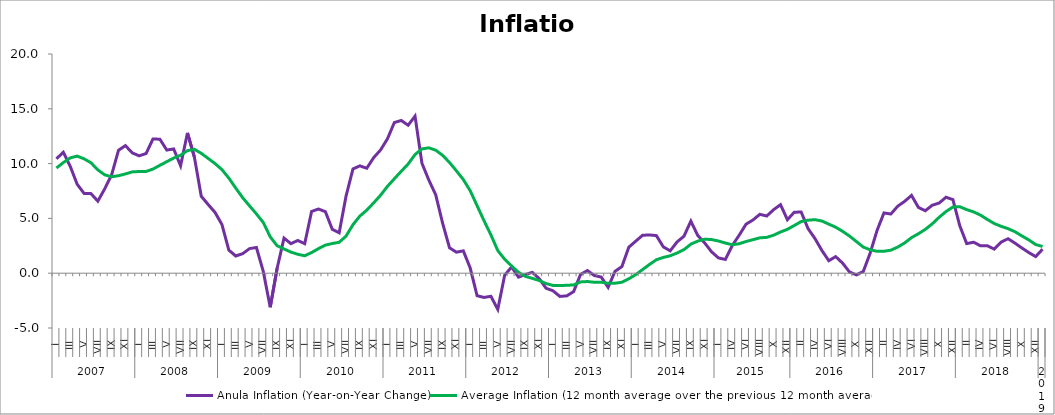
| Category | Anula Inflation (Year-on-Year Change) | Average Inflation (12 month average over the previous 12 month average) |
|---|---|---|
| 0 | 10.438 | 9.597 |
| 1 | 11.037 | 10.095 |
| 2 | 9.747 | 10.522 |
| 3 | 8.122 | 10.685 |
| 4 | 7.281 | 10.437 |
| 5 | 7.263 | 10.079 |
| 6 | 6.574 | 9.429 |
| 7 | 7.699 | 8.974 |
| 8 | 8.969 | 8.798 |
| 9 | 11.218 | 8.895 |
| 10 | 11.64 | 9.057 |
| 11 | 10.975 | 9.245 |
| 12 | 10.707 | 9.279 |
| 13 | 10.919 | 9.283 |
| 14 | 12.25 | 9.503 |
| 15 | 12.224 | 9.846 |
| 16 | 11.235 | 10.174 |
| 17 | 11.337 | 10.508 |
| 18 | 9.804 | 10.764 |
| 19 | 12.799 | 11.182 |
| 20 | 10.605 | 11.308 |
| 21 | 7.02 | 10.938 |
| 22 | 6.267 | 10.471 |
| 23 | 5.548 | 9.999 |
| 24 | 4.441 | 9.447 |
| 25 | 2.094 | 8.674 |
| 26 | 1.572 | 7.765 |
| 27 | 1.785 | 6.892 |
| 28 | 2.242 | 6.143 |
| 29 | 2.347 | 5.409 |
| 30 | 0.141 | 4.621 |
| 31 | -3.106 | 3.318 |
| 32 | 0.44 | 2.508 |
| 33 | 3.203 | 2.209 |
| 34 | 2.697 | 1.927 |
| 35 | 2.986 | 1.728 |
| 36 | 2.693 | 1.589 |
| 37 | 5.633 | 1.886 |
| 38 | 5.858 | 2.242 |
| 39 | 5.612 | 2.561 |
| 40 | 4.006 | 2.709 |
| 41 | 3.689 | 2.822 |
| 42 | 7.048 | 3.383 |
| 43 | 9.512 | 4.43 |
| 44 | 9.794 | 5.213 |
| 45 | 9.576 | 5.753 |
| 46 | 10.542 | 6.417 |
| 47 | 11.241 | 7.111 |
| 48 | 12.26 | 7.923 |
| 49 | 13.747 | 8.617 |
| 50 | 13.936 | 9.3 |
| 51 | 13.499 | 9.961 |
| 52 | 14.332 | 10.824 |
| 53 | 10.034 | 11.341 |
| 54 | 8.499 | 11.44 |
| 55 | 7.154 | 11.224 |
| 56 | 4.562 | 10.754 |
| 57 | 2.318 | 10.102 |
| 58 | 1.917 | 9.34 |
| 59 | 2.041 | 8.543 |
| 60 | 0.478 | 7.527 |
| 61 | -2.055 | 6.159 |
| 62 | -2.211 | 4.793 |
| 63 | -2.105 | 3.5 |
| 64 | -3.3 | 2.066 |
| 65 | -0.18 | 1.269 |
| 66 | 0.565 | 0.665 |
| 67 | -0.359 | 0.081 |
| 68 | -0.121 | -0.289 |
| 69 | 0.078 | -0.469 |
| 70 | -0.487 | -0.664 |
| 71 | -1.373 | -0.944 |
| 72 | -1.6 | -1.117 |
| 73 | -2.117 | -1.12 |
| 74 | -2.069 | -1.106 |
| 75 | -1.678 | -1.069 |
| 76 | -0.112 | -0.796 |
| 77 | 0.241 | -0.761 |
| 78 | -0.212 | -0.824 |
| 79 | -0.353 | -0.824 |
| 80 | -1.294 | -0.921 |
| 81 | 0.173 | -0.913 |
| 82 | 0.607 | -0.823 |
| 83 | 2.372 | -0.512 |
| 84 | 2.92 | -0.135 |
| 85 | 3.461 | 0.332 |
| 86 | 3.492 | 0.798 |
| 87 | 3.429 | 1.227 |
| 88 | 2.405 | 1.439 |
| 89 | 2.042 | 1.589 |
| 90 | 2.85 | 1.842 |
| 91 | 3.377 | 2.15 |
| 92 | 4.752 | 2.653 |
| 93 | 3.441 | 2.926 |
| 94 | 2.764 | 3.106 |
| 95 | 1.952 | 3.069 |
| 96 | 1.394 | 2.938 |
| 97 | 1.254 | 2.752 |
| 98 | 2.517 | 2.599 |
| 99 | 3.459 | 2.688 |
| 100 | 4.474 | 2.891 |
| 101 | 4.855 | 3.058 |
| 102 | 5.372 | 3.225 |
| 103 | 5.217 | 3.27 |
| 104 | 5.795 | 3.469 |
| 105 | 6.254 | 3.76 |
| 106 | 4.879 | 4.004 |
| 107 | 5.571 | 4.353 |
| 108 | 5.575 | 4.713 |
| 109 | 4.061 | 4.836 |
| 110 | 3.159 | 4.886 |
| 111 | 2.073 | 4.763 |
| 112 | 1.142 | 4.478 |
| 113 | 1.513 | 4.196 |
| 114 | 0.922 | 3.822 |
| 115 | 0.116 | 3.391 |
| 116 | -0.152 | 2.891 |
| 117 | 0.154 | 2.384 |
| 118 | 1.832 | 2.135 |
| 119 | 3.9 | 2 |
| 120 | 5.5 | 2 |
| 121 | 5.4 | 2.1 |
| 122 | 6.115 | 2.385 |
| 123 | 6.556 | 2.758 |
| 124 | 7.1 | 3.247 |
| 125 | 6 | 3.6 |
| 126 | 5.7 | 4 |
| 127 | 6.2 | 4.5 |
| 128 | 6.4 | 5.1 |
| 129 | 6.931 | 5.627 |
| 130 | 6.716 | 6.035 |
| 131 | 4.321 | 6.067 |
| 132 | 2.7 | 5.8 |
| 133 | 2.827 | 5.596 |
| 134 | 2.5 | 5.3 |
| 135 | 2.5 | 4.9 |
| 136 | 2.199 | 4.531 |
| 137 | 2.838 | 4.275 |
| 138 | 3.144 | 4.063 |
| 139 | 2.744 | 3.785 |
| 140 | 2.3 | 3.4 |
| 141 | 1.887 | 3.039 |
| 142 | 1.515 | 2.615 |
| 143 | 2.189 | 2.439 |